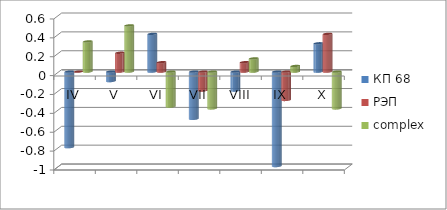
| Category | КП 68 | РЭП  | complex |
|---|---|---|---|
| IV | -0.8 | 0 | 0.32 |
| V | -0.1 | 0.2 | 0.49 |
| VI | 0.4 | 0.1 | -0.37 |
| VII | -0.5 | -0.2 | -0.39 |
| VIII | -0.2 | 0.1 | 0.14 |
| IX | -1 | -0.3 | 0.06 |
| X | 0.3 | 0.4 | -0.39 |